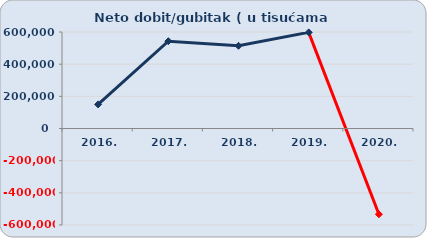
| Category | Neto dobit/gubitak |
|---|---|
| 2016. | 149817.077 |
| 2017. | 542875.342 |
| 2018. | 514368.533 |
| 2019. | 597616.465 |
| 2020. | -533232.225 |